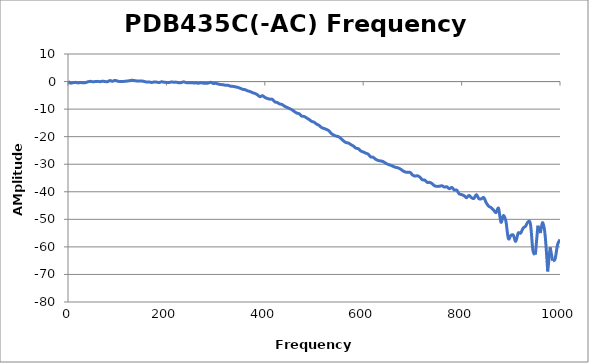
| Category | Series 0 |
|---|---|
| 0.3 | 0.04 |
| 5.2985 | -0.569 |
| 10.297 | -0.403 |
| 15.2955 | -0.291 |
| 20.294 | -0.49 |
| 25.2925 | -0.363 |
| 30.291 | -0.441 |
| 35.2895 | -0.392 |
| 40.288 | -0.104 |
| 45.2865 | 0.076 |
| 50.285 | -0.071 |
| 55.2835 | -0.003 |
| 60.282 | 0.068 |
| 65.2805 | -0.04 |
| 70.279 | 0.131 |
| 75.2775 | 0.004 |
| 80.276 | -0.031 |
| 85.2745 | 0.358 |
| 90.273 | 0.112 |
| 95.2715 | 0.416 |
| 100.27 | 0.188 |
| 105.2685 | 0.017 |
| 110.267 | 0.033 |
| 115.2655 | 0.082 |
| 120.264 | 0.191 |
| 125.2625 | 0.315 |
| 130.261 | 0.447 |
| 135.2595 | 0.337 |
| 140.258 | 0.221 |
| 145.2565 | 0.181 |
| 150.255 | 0.206 |
| 155.2535 | 0.005 |
| 160.252 | -0.164 |
| 165.2505 | -0.137 |
| 170.249 | -0.33 |
| 175.2475 | -0.122 |
| 180.246 | -0.213 |
| 185.2445 | -0.346 |
| 190.243 | -0.083 |
| 195.2415 | -0.244 |
| 200.24 | -0.315 |
| 205.2385 | -0.353 |
| 210.237 | -0.157 |
| 215.2355 | -0.233 |
| 220.234 | -0.217 |
| 225.2325 | -0.474 |
| 230.231 | -0.373 |
| 235.2295 | -0.1 |
| 240.228 | -0.396 |
| 245.2265 | -0.449 |
| 250.225 | -0.396 |
| 255.2235 | -0.496 |
| 260.222 | -0.478 |
| 265.2205 | -0.601 |
| 270.219 | -0.433 |
| 275.2175 | -0.594 |
| 280.216 | -0.601 |
| 285.2145 | -0.559 |
| 290.213 | -0.261 |
| 295.2115 | -0.7 |
| 300.21 | -0.638 |
| 305.2085 | -0.887 |
| 310.207 | -1.085 |
| 315.2055 | -1.151 |
| 320.204 | -1.348 |
| 325.2025 | -1.353 |
| 330.201 | -1.678 |
| 335.1995 | -1.752 |
| 340.198 | -1.928 |
| 345.1965 | -2.116 |
| 350.195 | -2.449 |
| 355.1935 | -2.805 |
| 360.192 | -2.97 |
| 365.1905 | -3.367 |
| 370.189 | -3.635 |
| 375.1875 | -4.047 |
| 380.186 | -4.33 |
| 385.1845 | -4.813 |
| 390.183 | -5.502 |
| 395.1815 | -5.123 |
| 400.18 | -5.746 |
| 405.1785 | -6.144 |
| 410.177 | -6.377 |
| 415.1755 | -6.444 |
| 420.174 | -7.341 |
| 425.1725 | -7.614 |
| 430.171 | -8.124 |
| 435.1695 | -8.333 |
| 440.168 | -8.953 |
| 445.1665 | -9.371 |
| 450.165 | -9.814 |
| 455.1635 | -10.223 |
| 460.162 | -10.896 |
| 465.1605 | -11.455 |
| 470.159 | -11.689 |
| 475.1575 | -12.551 |
| 480.156 | -12.675 |
| 485.1545 | -13.23 |
| 490.153 | -13.779 |
| 495.1515 | -14.439 |
| 500.15 | -14.736 |
| 505.1485 | -15.432 |
| 510.147 | -15.88 |
| 515.1455 | -16.658 |
| 520.144 | -17.019 |
| 525.1425 | -17.355 |
| 530.141 | -17.834 |
| 535.1395 | -18.838 |
| 540.138 | -19.414 |
| 545.1365 | -19.818 |
| 550.135 | -20.024 |
| 555.1335 | -20.743 |
| 560.132 | -21.543 |
| 565.1305 | -22.144 |
| 570.129 | -22.333 |
| 575.1275 | -22.91 |
| 580.126 | -23.408 |
| 585.1245 | -24.156 |
| 590.123 | -24.384 |
| 595.1215 | -25.185 |
| 600.12 | -25.557 |
| 605.1185 | -25.983 |
| 610.117 | -26.337 |
| 615.1155 | -27.35 |
| 620.114 | -27.46 |
| 625.1125 | -28.182 |
| 630.111 | -28.614 |
| 635.1095 | -28.788 |
| 640.108 | -29.031 |
| 645.1065 | -29.556 |
| 650.105 | -30.026 |
| 655.1035 | -30.317 |
| 660.102 | -30.718 |
| 665.1005 | -31.083 |
| 670.099 | -31.293 |
| 675.0975 | -31.688 |
| 680.096 | -32.331 |
| 685.0945 | -32.803 |
| 690.093 | -32.957 |
| 695.0915 | -32.939 |
| 700.09 | -33.859 |
| 705.0885 | -34.316 |
| 710.087 | -34.182 |
| 715.0855 | -34.657 |
| 720.084 | -35.635 |
| 725.0825 | -35.737 |
| 730.081 | -36.578 |
| 735.0795 | -36.588 |
| 740.078 | -37.046 |
| 745.0765 | -37.831 |
| 750.075 | -38.036 |
| 755.0735 | -37.995 |
| 760.072 | -37.823 |
| 765.0705 | -38.293 |
| 770.069 | -38.186 |
| 775.0675 | -38.889 |
| 780.066 | -38.424 |
| 785.0645 | -39.332 |
| 790.063 | -39.404 |
| 795.0615 | -40.745 |
| 800.06 | -41.025 |
| 805.0585 | -41.44 |
| 810.057 | -42.156 |
| 815.0555 | -41.317 |
| 820.054 | -42.14 |
| 825.0525 | -42.402 |
| 830.051 | -41.037 |
| 835.0495 | -42.498 |
| 840.048 | -42.575 |
| 845.0465 | -42.095 |
| 850.045 | -43.979 |
| 855.0435 | -45.224 |
| 860.042 | -45.76 |
| 865.0405 | -46.669 |
| 870.039 | -47.568 |
| 875.0375 | -45.985 |
| 880.036 | -51.063 |
| 885.0345 | -48.594 |
| 890.033 | -50.696 |
| 895.0315 | -56.929 |
| 900.03 | -55.859 |
| 905.0285 | -55.725 |
| 910.027 | -57.975 |
| 915.0255 | -54.981 |
| 920.024 | -55.013 |
| 925.0225 | -53.19 |
| 930.021 | -52.499 |
| 935.0195 | -50.937 |
| 940.018 | -51.766 |
| 945.0165 | -61.353 |
| 950.015 | -62.771 |
| 955.0135 | -52.313 |
| 960.012 | -54.978 |
| 965.0105 | -51.214 |
| 970.009 | -56.196 |
| 975.0075 | -68.926 |
| 980.006 | -60.16 |
| 985.0045 | -64.994 |
| 990.003 | -64.398 |
| 995.0015 | -59.233 |
| 1000.0 | -57.316 |